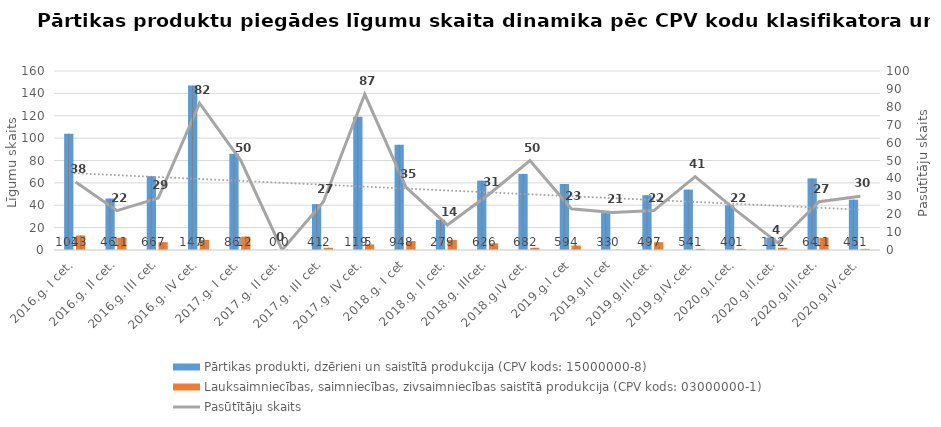
| Category | Pārtikas produkti, dzērieni un saistītā produkcija (CPV kods: 15000000-8) | Lauksaimniecības, saimniecības, zivsaimniecības saistītā produkcija (CPV kods: 03000000-1) |
|---|---|---|
| 2016.g. I cet. | 104 | 13 |
| 2016.g. II cet. | 46 | 11 |
| 2016.g. III cet. | 66 | 7 |
| 2016.g. IV cet. | 147 | 9 |
| 2017.g. I cet. | 86 | 12 |
| 2017.g. II cet. | 0 | 0 |
| 2017.g. III cet. | 41 | 2 |
| 2017.g. IV cet. | 119 | 5 |
| 2018.g. I cet | 94 | 8 |
| 2018.g. II cet. | 27 | 9 |
| 2018.g. IIIcet. | 62 | 6 |
| 2018.g.IV cet. | 68 | 2 |
| 2019.g.I cet | 59 | 4 |
| 2019.g.II cet | 33 | 0 |
| 2019.g.III.cet. | 49 | 7 |
| 2019.g.IV.cet. | 54 | 1 |
| 2020.g.I.cet. | 40 | 1 |
| 2020.g.II.cet. | 11 | 2 |
| 2020.g.III.cet. | 64 | 11 |
| 2020.g.IV.cet. | 45 | 1 |